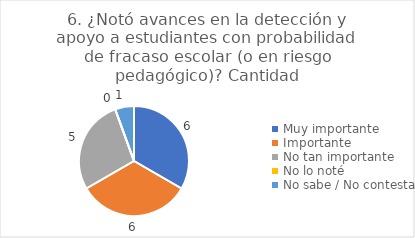
| Category | 6. ¿Notó avances en la detección y apoyo a estudiantes con probabilidad de fracaso escolar (o en riesgo pedagógico)? |
|---|---|
| Muy importante  | 0.333 |
| Importante  | 0.333 |
| No tan importante  | 0.278 |
| No lo noté  | 0 |
| No sabe / No contesta | 0.056 |